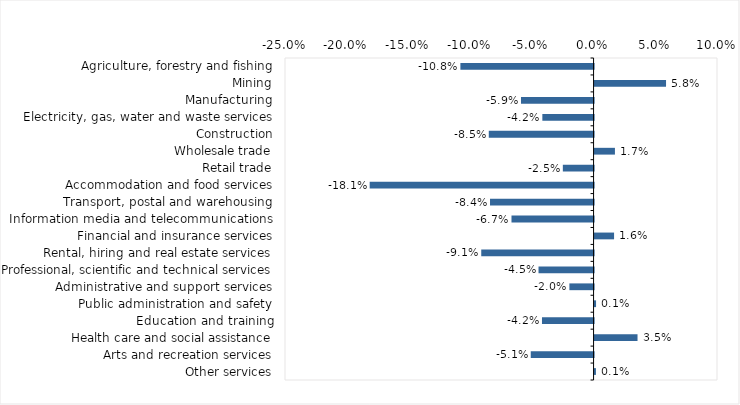
| Category | This week |
|---|---|
| Agriculture, forestry and fishing | -0.108 |
| Mining | 0.058 |
| Manufacturing | -0.059 |
| Electricity, gas, water and waste services | -0.042 |
| Construction | -0.085 |
| Wholesale trade | 0.016 |
| Retail trade | -0.025 |
| Accommodation and food services | -0.181 |
| Transport, postal and warehousing | -0.084 |
| Information media and telecommunications | -0.066 |
| Financial and insurance services | 0.016 |
| Rental, hiring and real estate services | -0.091 |
| Professional, scientific and technical services | -0.045 |
| Administrative and support services | -0.02 |
| Public administration and safety | 0.001 |
| Education and training | -0.042 |
| Health care and social assistance | 0.035 |
| Arts and recreation services | -0.051 |
| Other services | 0.001 |